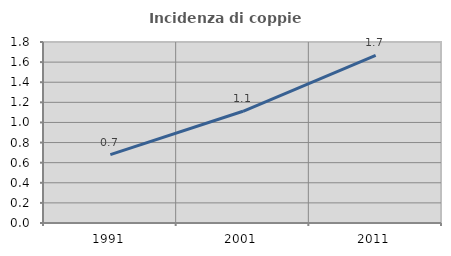
| Category | Incidenza di coppie miste |
|---|---|
| 1991.0 | 0.68 |
| 2001.0 | 1.111 |
| 2011.0 | 1.667 |